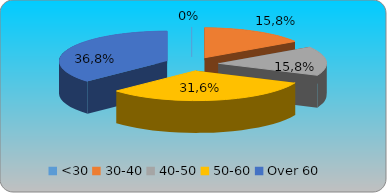
| Category | Series 0 | Series 1 | Series 2 | Series 3 |
|---|---|---|---|---|
| <30 | 0 |  |  |  |
| 30-40 | 0.158 |  |  |  |
| 40-50 | 0.158 |  |  |  |
| 50-60 | 0.316 |  |  |  |
| Over 60 | 0.368 |  |  |  |